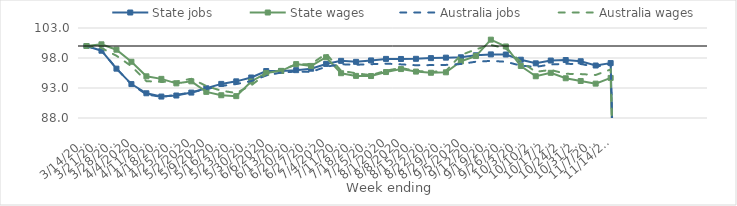
| Category | State jobs | State wages | Australia jobs | Australia wages |
|---|---|---|---|---|
| 14/03/2020 | 100 | 100 | 100 | 100 |
| 21/03/2020 | 99.215 | 100.28 | 99.252 | 99.658 |
| 28/03/2020 | 96.224 | 99.382 | 96.25 | 98.378 |
| 04/04/2020 | 93.652 | 97.375 | 93.61 | 96.634 |
| 11/04/2020 | 92.121 | 94.947 | 91.936 | 94.139 |
| 18/04/2020 | 91.574 | 94.522 | 91.515 | 94.01 |
| 25/04/2020 | 91.748 | 93.77 | 91.861 | 94.076 |
| 02/05/2020 | 92.237 | 94.114 | 92.263 | 94.531 |
| 09/05/2020 | 92.953 | 92.355 | 92.818 | 93.346 |
| 16/05/2020 | 93.682 | 91.792 | 93.348 | 92.542 |
| 23/05/2020 | 94.109 | 91.645 | 93.657 | 92.17 |
| 30/05/2020 | 94.751 | 94.084 | 94.157 | 93.446 |
| 06/06/2020 | 95.828 | 95.498 | 95.081 | 95.354 |
| 13/06/2020 | 95.831 | 95.857 | 95.581 | 96.009 |
| 20/06/2020 | 95.974 | 96.98 | 95.73 | 96.914 |
| 27/06/2020 | 96.216 | 96.679 | 95.677 | 96.999 |
| 04/07/2020 | 97.011 | 98.124 | 96.551 | 98.71 |
| 11/07/2020 | 97.523 | 95.464 | 96.956 | 95.878 |
| 18/07/2020 | 97.36 | 95.02 | 96.874 | 95.454 |
| 25/07/2020 | 97.594 | 94.997 | 96.966 | 95.136 |
| 01/08/2020 | 97.849 | 95.657 | 97.062 | 95.894 |
| 08/08/2020 | 97.836 | 96.155 | 96.936 | 96.337 |
| 15/08/2020 | 97.866 | 95.736 | 96.797 | 95.858 |
| 22/08/2020 | 97.98 | 95.539 | 96.815 | 95.687 |
| 29/08/2020 | 98.059 | 95.615 | 96.851 | 95.834 |
| 05/09/2020 | 98.12 | 97.431 | 96.995 | 98.49 |
| 12/09/2020 | 98.453 | 98.325 | 97.381 | 99.44 |
| 19/09/2020 | 98.601 | 101.055 | 97.514 | 100.193 |
| 26/09/2020 | 98.581 | 99.922 | 97.375 | 99.575 |
| 03/10/2020 | 97.715 | 96.675 | 96.725 | 97.427 |
| 10/10/2020 | 97.113 | 94.956 | 96.517 | 95.692 |
| 17/10/2020 | 97.578 | 95.529 | 96.926 | 96.016 |
| 24/10/2020 | 97.66 | 94.625 | 97.027 | 95.365 |
| 31/10/2020 | 97.46 | 94.17 | 97.003 | 95.32 |
| 07/11/2020 | 96.749 | 93.728 | 96.523 | 95.17 |
| 14/11/2020 | 97.152 | 94.681 | 97.067 | 96.091 |